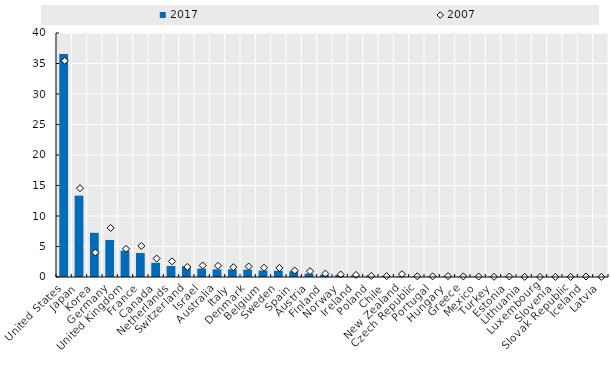
| Category | 2017 |
|---|---|
| United States | 36.553 |
| Japan | 13.337 |
| Korea | 7.245 |
| Germany | 6.074 |
| United Kingdom | 4.316 |
| France | 3.932 |
| Canada | 2.33 |
| Netherlands | 1.806 |
| Switzerland | 1.752 |
| Israel | 1.369 |
| Australia | 1.25 |
| Italy | 1.243 |
| Denmark | 1.19 |
| Belgium | 1.052 |
| Sweden | 1.023 |
| Spain | 0.946 |
| Austria | 0.55 |
| Finland | 0.35 |
| Norway | 0.33 |
| Ireland | 0.248 |
| Poland | 0.244 |
| Chile | 0.135 |
| New Zealand | 0.122 |
| Czech Republic | 0.115 |
| Portugal | 0.115 |
| Hungary | 0.084 |
| Greece | 0.069 |
| Mexico | 0.066 |
| Turkey | 0.052 |
| Estonia | 0.041 |
| Lithuania | 0.037 |
| Luxembourg | 0.033 |
| Slovenia | 0.029 |
| Slovak Republic | 0.023 |
| Iceland | 0.02 |
| Latvia | 0.007 |